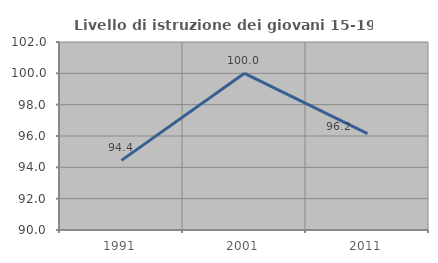
| Category | Livello di istruzione dei giovani 15-19 anni |
|---|---|
| 1991.0 | 94.444 |
| 2001.0 | 100 |
| 2011.0 | 96.154 |